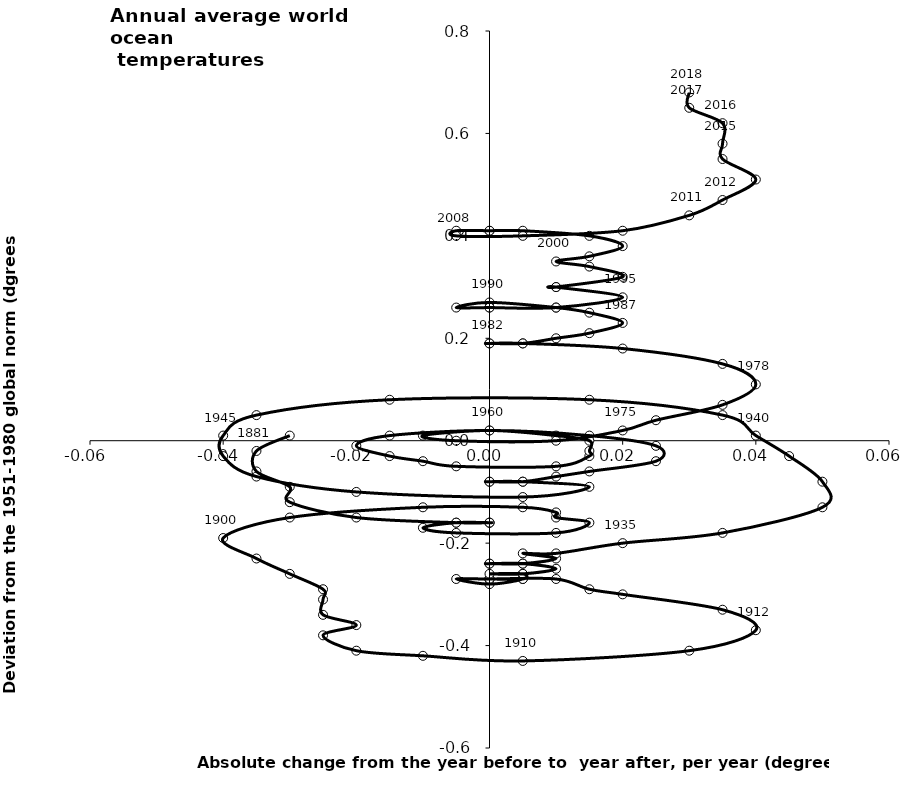
| Category | Series 0 |
|---|---|
| -0.03 | 0.01 |
| -0.034999999999999996 | -0.02 |
| -0.034999999999999996 | -0.06 |
| -0.03 | -0.09 |
| -0.03 | -0.12 |
| -0.020000000000000004 | -0.15 |
| -0.0050000000000000044 | -0.16 |
| 0.0 | -0.16 |
| 0.0 | -0.16 |
| 0.0 | -0.16 |
| -0.0050000000000000044 | -0.16 |
| -0.009999999999999995 | -0.17 |
| -0.0049999999999999906 | -0.18 |
| 0.009999999999999995 | -0.18 |
| 0.015 | -0.16 |
| 0.009999999999999995 | -0.15 |
| 0.009999999999999995 | -0.14 |
| 0.0050000000000000044 | -0.13 |
| -0.009999999999999995 | -0.13 |
| -0.03 | -0.15 |
| -0.04000000000000001 | -0.19 |
| -0.035 | -0.23 |
| -0.029999999999999985 | -0.26 |
| -0.024999999999999994 | -0.29 |
| -0.025000000000000022 | -0.31 |
| -0.024999999999999994 | -0.34 |
| -0.01999999999999999 | -0.36 |
| -0.024999999999999994 | -0.38 |
| -0.01999999999999999 | -0.41 |
| -0.010000000000000009 | -0.42 |
| 0.0050000000000000044 | -0.43 |
| 0.03 | -0.41 |
| 0.03999999999999998 | -0.37 |
| 0.035 | -0.33 |
| 0.020000000000000018 | -0.3 |
| 0.014999999999999986 | -0.29 |
| 0.009999999999999981 | -0.27 |
| 0.0 | -0.27 |
| -0.0050000000000000044 | -0.27 |
| 0.0 | -0.28 |
| 0.0050000000000000044 | -0.27 |
| 0.0 | -0.27 |
| 0.0 | -0.27 |
| 0.0050000000000000044 | -0.27 |
| 0.0050000000000000044 | -0.26 |
| 0.0 | -0.26 |
| 0.0050000000000000044 | -0.26 |
| 0.010000000000000009 | -0.25 |
| 0.0050000000000000044 | -0.24 |
| 0.0 | -0.24 |
| 0.0 | -0.24 |
| 0.0049999999999999906 | -0.24 |
| 0.009999999999999995 | -0.23 |
| 0.0050000000000000044 | -0.22 |
| 0.009999999999999995 | -0.22 |
| 0.020000000000000004 | -0.2 |
| 0.035 | -0.18 |
| 0.049999999999999996 | -0.13 |
| 0.05 | -0.08 |
| 0.045 | -0.03 |
| 0.04 | 0.01 |
| 0.035 | 0.05 |
| 0.015 | 0.08 |
| -0.015 | 0.08 |
| -0.035 | 0.05 |
| -0.04 | 0.01 |
| -0.04 | -0.03 |
| -0.035 | -0.07 |
| -0.019999999999999997 | -0.1 |
| 0.0050000000000000044 | -0.11 |
| 0.015 | -0.09 |
| 0.0049999999999999975 | -0.08 |
| 0.0 | -0.08 |
| 0.0 | -0.08 |
| 0.0049999999999999975 | -0.08 |
| 0.010000000000000002 | -0.07 |
| 0.015000000000000003 | -0.06 |
| 0.024999999999999998 | -0.04 |
| 0.025 | -0.01 |
| 0.015 | 0.01 |
| 0.0 | 0.02 |
| -0.015 | 0.01 |
| -0.02 | -0.01 |
| -0.015 | -0.03 |
| -0.010000000000000002 | -0.04 |
| -0.005000000000000001 | -0.05 |
| 0.010000000000000002 | -0.05 |
| 0.015000000000000001 | -0.03 |
| 0.015 | -0.02 |
| 0.015 | 0 |
| 0.01 | 0.01 |
| 0.0 | 0.02 |
| -0.01 | 0.01 |
| -0.005 | 0 |
| 0.01 | 0 |
| 0.02 | 0.02 |
| 0.025 | 0.04 |
| 0.035 | 0.07 |
| 0.039999999999999994 | 0.11 |
| 0.034999999999999996 | 0.15 |
| 0.020000000000000004 | 0.18 |
| 0.0050000000000000044 | 0.19 |
| 0.0 | 0.19 |
| 0.0 | 0.19 |
| 0.0050000000000000044 | 0.19 |
| 0.009999999999999995 | 0.2 |
| 0.015 | 0.21 |
| 0.020000000000000004 | 0.23 |
| 0.015 | 0.25 |
| 0.010000000000000009 | 0.26 |
| 0.0 | 0.27 |
| -0.0050000000000000044 | 0.26 |
| 0.0 | 0.26 |
| 0.0 | 0.26 |
| 0.010000000000000009 | 0.26 |
| 0.01999999999999999 | 0.28 |
| 0.009999999999999981 | 0.3 |
| 0.010000000000000009 | 0.3 |
| 0.020000000000000018 | 0.32 |
| 0.014999999999999986 | 0.34 |
| 0.009999999999999981 | 0.35 |
| 0.015000000000000013 | 0.36 |
| 0.020000000000000018 | 0.38 |
| 0.014999999999999986 | 0.4 |
| 0.004999999999999977 | 0.41 |
| 0.0 | 0.41 |
| 0.0 | 0.41 |
| -0.004999999999999977 | 0.41 |
| -0.004999999999999977 | 0.4 |
| 0.004999999999999977 | 0.4 |
| 0.01999999999999999 | 0.41 |
| 0.03 | 0.44 |
| 0.035 | 0.47 |
| 0.040000000000000036 | 0.51 |
| 0.034999999999999976 | 0.55 |
| 0.034999999999999976 | 0.58 |
| 0.03500000000000003 | 0.62 |
| 0.030000000000000027 | 0.65 |
| 0.030000000000000027 | 0.68 |